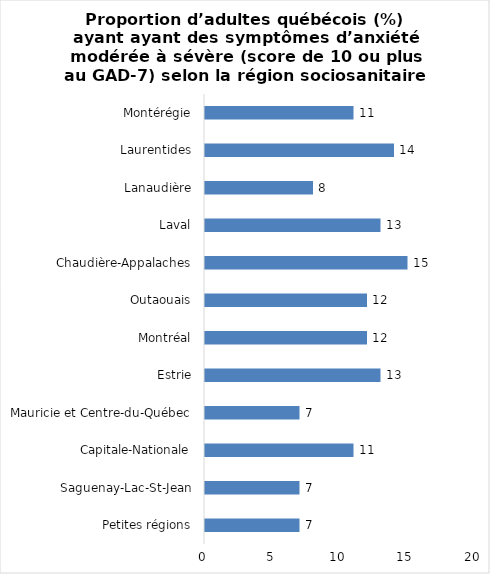
| Category | Series 0 |
|---|---|
| Petites régions | 7 |
| Saguenay-Lac-St-Jean | 7 |
| Capitale-Nationale | 11 |
| Mauricie et Centre-du-Québec | 7 |
| Estrie | 13 |
| Montréal | 12 |
| Outaouais | 12 |
| Chaudière-Appalaches | 15 |
| Laval | 13 |
| Lanaudière | 8 |
| Laurentides | 14 |
| Montérégie | 11 |